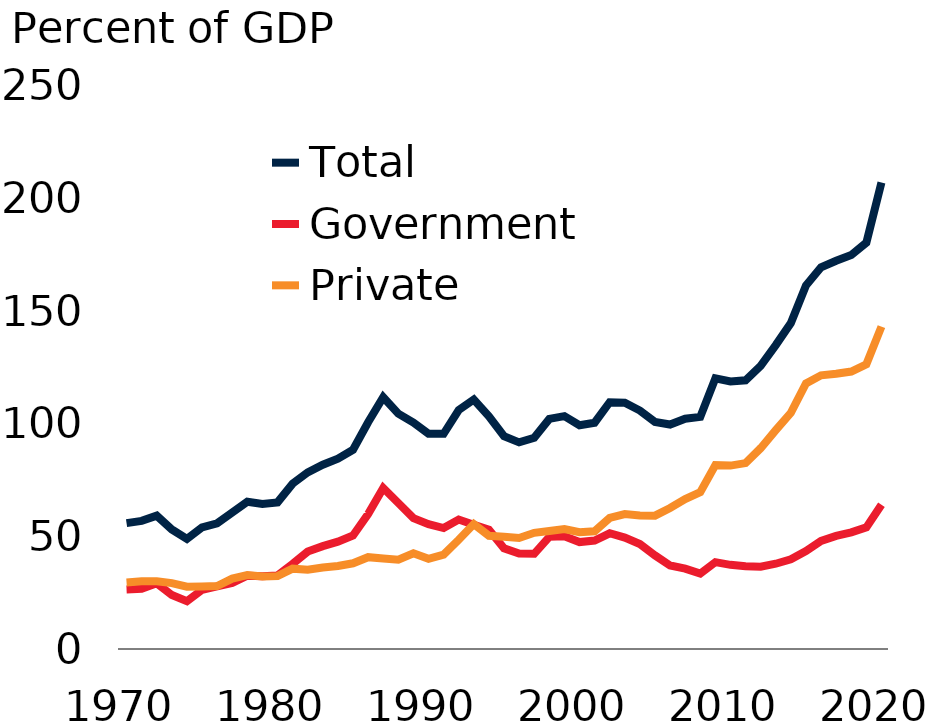
| Category | Total | Government | Private |
|---|---|---|---|
| 1970.0 | 55.8 | 26.4 | 29.5 |
| 1971.0 | 56.8 | 26.7 | 30 |
| 1972.0 | 59.1 | 29.1 | 30 |
| 1973.0 | 53 | 23.9 | 29.2 |
| 1974.0 | 48.8 | 21.2 | 27.6 |
| 1975.0 | 53.9 | 26.2 | 27.7 |
| 1976.0 | 55.7 | 27.8 | 27.9 |
| 1977.0 | 60.5 | 29.3 | 31.2 |
| 1978.0 | 65.3 | 32.5 | 32.8 |
| 1979.0 | 64.3 | 32.2 | 32.1 |
| 1980.0 | 65 | 32.6 | 32.3 |
| 1981.0 | 73.3 | 37.7 | 35.6 |
| 1982.0 | 78.3 | 43.2 | 35.1 |
| 1983.0 | 81.7 | 45.6 | 36.1 |
| 1984.0 | 84.4 | 47.6 | 36.8 |
| 1985.0 | 88.3 | 50.3 | 38 |
| 1986.0 | 100.5 | 59.8 | 40.7 |
| 1987.0 | 111.6 | 71.4 | 40.1 |
| 1988.0 | 104.3 | 64.7 | 39.6 |
| 1989.0 | 100.4 | 58 | 42.4 |
| 1990.0 | 95.4 | 55.3 | 40 |
| 1991.0 | 95.4 | 53.6 | 41.8 |
| 1992.0 | 105.9 | 57.4 | 48.4 |
| 1993.0 | 110.6 | 55.1 | 55.4 |
| 1994.0 | 103.1 | 52.9 | 50.2 |
| 1995.0 | 94.3 | 44.6 | 49.8 |
| 1996.0 | 91.6 | 42.3 | 49.2 |
| 1997.0 | 93.6 | 42.2 | 51.5 |
| 1998.0 | 102 | 49.7 | 52.3 |
| 1999.0 | 103.2 | 50 | 53.2 |
| 2000.0 | 99.2 | 47.4 | 51.8 |
| 2001.0 | 100.3 | 48.1 | 52.2 |
| 2002.0 | 109.4 | 51.3 | 58.1 |
| 2003.0 | 109.2 | 49.4 | 59.8 |
| 2004.0 | 105.7 | 46.5 | 59.2 |
| 2005.0 | 100.6 | 41.5 | 59.1 |
| 2006.0 | 99.5 | 37 | 62.5 |
| 2007.0 | 102.1 | 35.6 | 66.5 |
| 2008.0 | 102.9 | 33.4 | 69.5 |
| 2009.0 | 120 | 38.5 | 81.5 |
| 2010.0 | 118.6 | 37.3 | 81.3 |
| 2011.0 | 119.1 | 36.7 | 82.4 |
| 2012.0 | 125.5 | 36.5 | 89 |
| 2013.0 | 134.7 | 37.8 | 97 |
| 2014.0 | 144.5 | 39.8 | 104.7 |
| 2015.0 | 161.1 | 43.4 | 117.7 |
| 2016.0 | 169.2 | 47.9 | 121.3 |
| 2017.0 | 172.1 | 50.1 | 122 |
| 2018.0 | 174.6 | 51.7 | 123 |
| 2019.0 | 180.1 | 53.9 | 126.2 |
| 2020.0 | 206.8 | 63.9 | 142.9 |